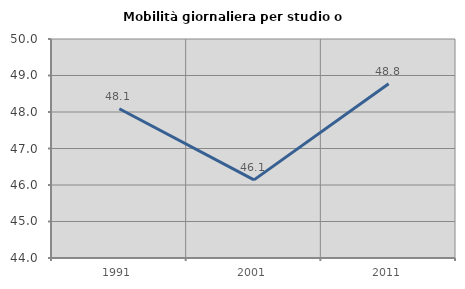
| Category | Mobilità giornaliera per studio o lavoro |
|---|---|
| 1991.0 | 48.088 |
| 2001.0 | 46.14 |
| 2011.0 | 48.773 |